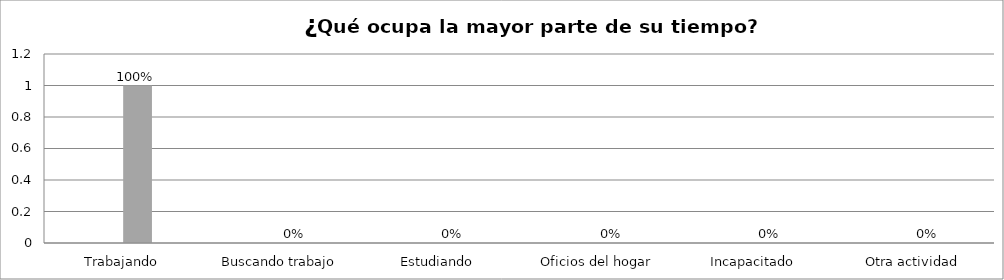
| Category | Series 0 | Series 1 | Series 2 | Series 3 |
|---|---|---|---|---|
| Trabajando |  |  | 1 |  |
| Buscando trabajo |  |  | 0 |  |
| Estudiando |  |  | 0 |  |
| Oficios del hogar |  |  | 0 |  |
| Incapacitado  |  |  | 0 |  |
| Otra actividad |  |  | 0 |  |